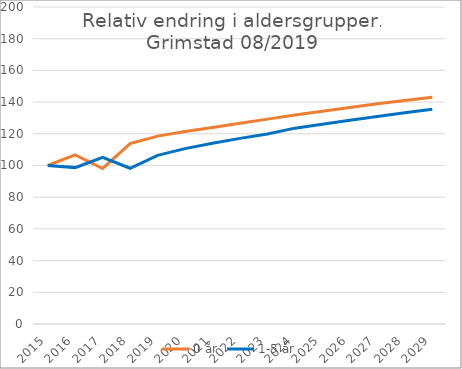
| Category | 0 år | 1-5 år |
|---|---|---|
| 2015.0 | 100 | 100 |
| 2016.0 | 106.719 | 98.67 |
| 2017.0 | 98.123 | 105.14 |
| 2018.0 | 113.834 | 98.254 |
| 2019.0 | 118.521 | 106.417 |
| 2020.0 | 121.408 | 110.63 |
| 2021.0 | 124.02 | 114.033 |
| 2022.0 | 126.616 | 117.119 |
| 2023.0 | 129.254 | 119.889 |
| 2024.0 | 131.818 | 123.568 |
| 2025.0 | 134.295 | 126.089 |
| 2026.0 | 136.647 | 128.57 |
| 2027.0 | 138.925 | 130.981 |
| 2028.0 | 141.035 | 133.287 |
| 2029.0 | 143.046 | 135.444 |